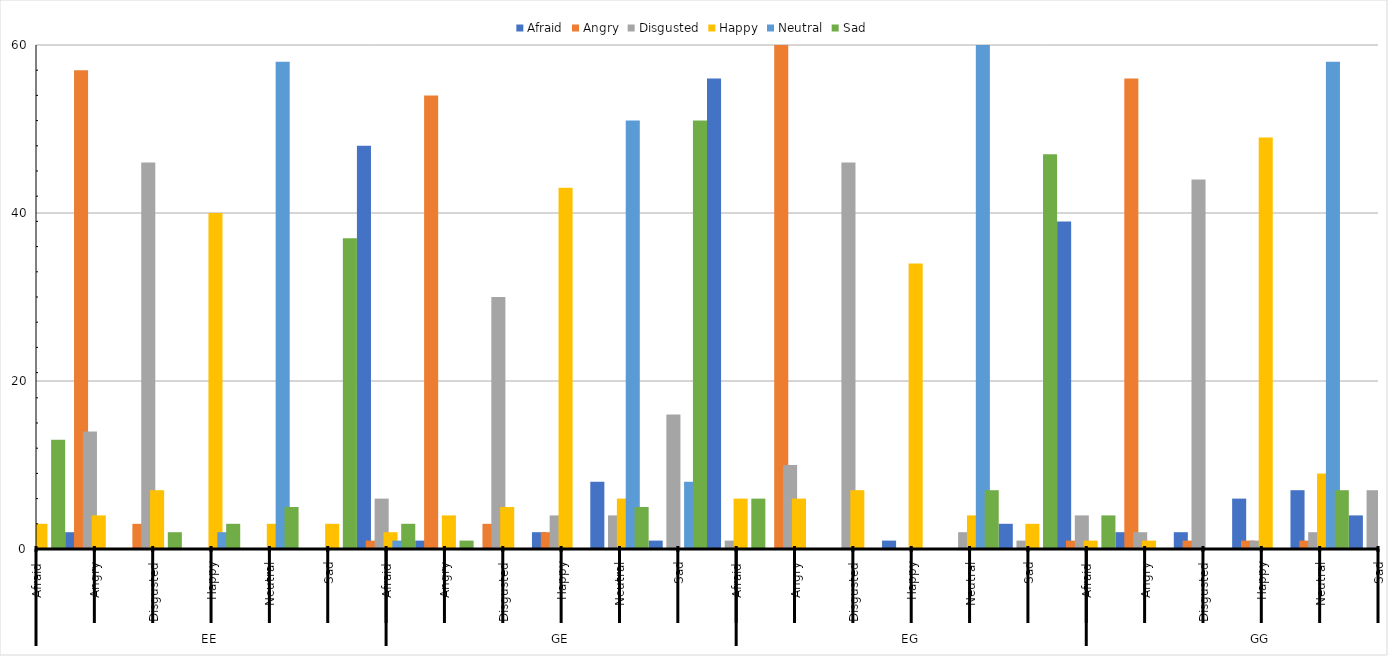
| Category | Afraid | Angry | Disgusted | Happy | Neutral | Sad |
|---|---|---|---|---|---|---|
| 0 | 58 | 0 | 0 | 3 | 0 | 13 |
| 1 | 2 | 57 | 14 | 4 | 0 | 0 |
| 2 | 0 | 3 | 46 | 7 | 0 | 2 |
| 3 | 0 | 0 | 0 | 40 | 2 | 3 |
| 4 | 0 | 0 | 0 | 3 | 58 | 5 |
| 5 | 0 | 0 | 0 | 3 | 0 | 37 |
| 6 | 48 | 1 | 6 | 2 | 1 | 3 |
| 7 | 1 | 54 | 0 | 4 | 0 | 1 |
| 8 | 0 | 3 | 30 | 5 | 0 | 0 |
| 9 | 2 | 2 | 4 | 43 | 0 | 0 |
| 10 | 8 | 0 | 4 | 6 | 51 | 5 |
| 11 | 1 | 0 | 16 | 0 | 8 | 51 |
| 12 | 56 | 0 | 1 | 6 | 0 | 6 |
| 13 | 0 | 60 | 10 | 6 | 0 | 0 |
| 14 | 0 | 0 | 46 | 7 | 0 | 0 |
| 15 | 1 | 0 | 0 | 34 | 0 | 0 |
| 16 | 0 | 0 | 2 | 4 | 60 | 7 |
| 17 | 3 | 0 | 1 | 3 | 0 | 47 |
| 18 | 39 | 1 | 4 | 1 | 0 | 4 |
| 19 | 2 | 56 | 2 | 1 | 0 | 0 |
| 20 | 2 | 1 | 44 | 0 | 0 | 0 |
| 21 | 6 | 1 | 1 | 49 | 0 | 0 |
| 22 | 7 | 1 | 2 | 9 | 58 | 7 |
| 23 | 4 | 0 | 7 | 0 | 2 | 49 |